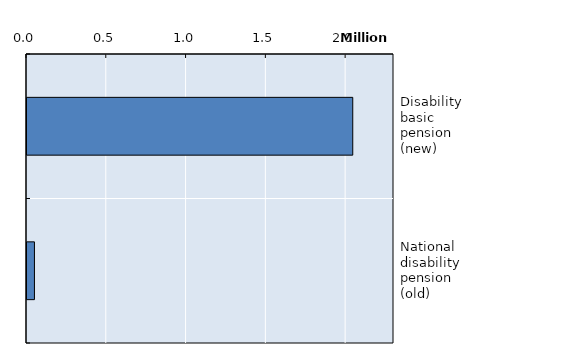
| Category | Series 0 |
|---|---|
| Disability basic pension (new) | 2041537 |
| National disability pension (old) | 46708 |